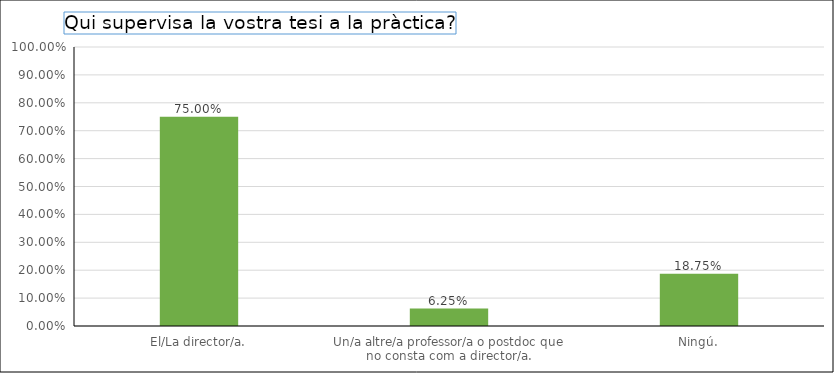
| Category | Series 0 |
|---|---|
| El/La director/a. | 0.75 |
| Un/a altre/a professor/a o postdoc que no consta com a director/a. | 0.062 |
| Ningú. | 0.188 |